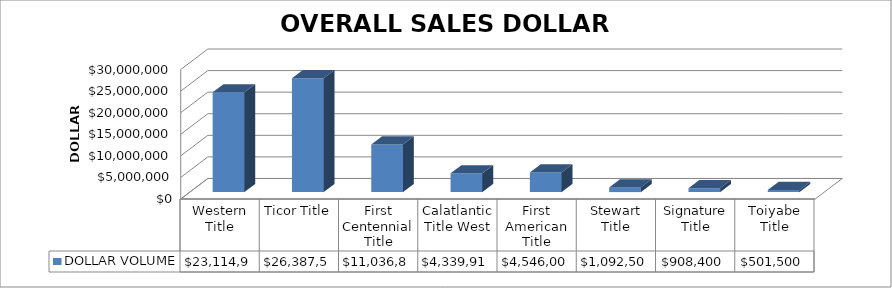
| Category | DOLLAR VOLUME |
|---|---|
| Western Title | 23114917 |
| Ticor Title | 26387500 |
| First Centennial Title | 11036849 |
| Calatlantic Title West | 4339914 |
| First American Title | 4546000 |
| Stewart Title | 1092500 |
| Signature Title | 908400 |
| Toiyabe Title | 501500 |